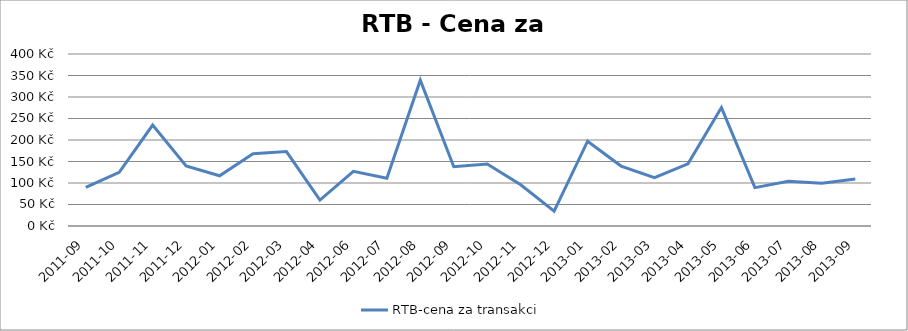
| Category | RTB-cena za transakci |
|---|---|
| 2011-09 | 89.593 |
| 2011-10 | 124.667 |
| 2011-11 | 234.715 |
| 2011-12 | 139.757 |
| 2012-01 | 116.86 |
| 2012-02 | 168.264 |
| 2012-03 | 173.055 |
| 2012-04 | 60.28 |
| 2012-06 | 127.218 |
| 2012-07 | 110.924 |
| 2012-08 | 339.183 |
| 2012-09 | 137.91 |
| 2012-10 | 144.157 |
| 2012-11 | 95.984 |
| 2012-12 | 34.425 |
| 2013-01 | 197.248 |
| 2013-02 | 139.417 |
| 2013-03 | 112.511 |
| 2013-04 | 144.5 |
| 2013-05 | 275.414 |
| 2013-06 | 89.259 |
| 2013-07 | 104.177 |
| 2013-08 | 99.675 |
| 2013-09 | 109.428 |